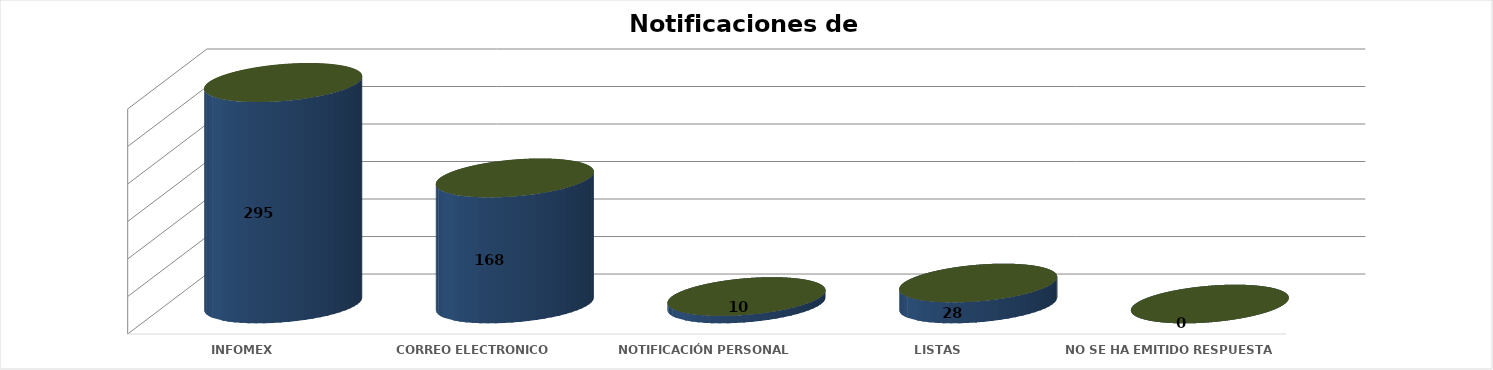
| Category | Series 0 | Series 1 | Series 2 | Series 3 | Series 4 |
|---|---|---|---|---|---|
| INFOMEX |  |  |  | 295 | 0.589 |
| CORREO ELECTRONICO |  |  |  | 168 | 0.335 |
| NOTIFICACIÓN PERSONAL |  |  |  | 10 | 0.02 |
| LISTAS |  |  |  | 28 | 0.056 |
|  NO SE HA EMITIDO RESPUESTA |  |  |  | 0 | 0 |